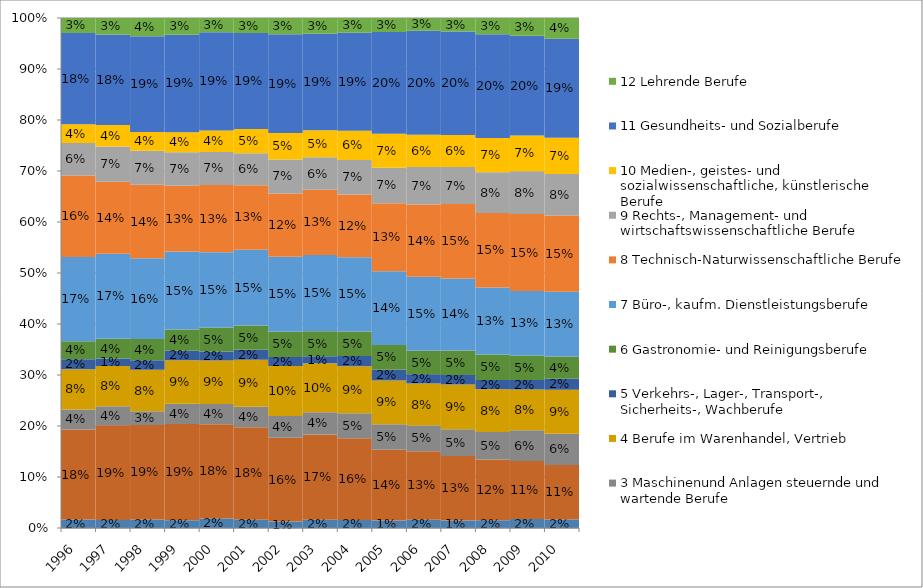
| Category | 1 Rohstoff gewinnende Berufe | 2 Be-, verarbeitende und instandsetzende Berufe | 3 Maschinenund Anlagen steuernde und wartende Berufe | 4 Berufe im Warenhandel, Vertrieb | 5 Verkehrs-, Lager-, Transport-, Sicherheits-, Wachberufe | 6 Gastronomie- und Reinigungsberufe | 7 Büro-, kaufm. Dienstleistungsberufe | 8 Technisch-Naturwissenschaftliche Berufe | 9 Rechts-, Management- und wirtschaftswissenschaftliche Berufe | 10 Medien-, geistes- und sozialwissenschaftliche, künstlerische Berufe | 11 Gesundheits- und Sozialberufe | 12 Lehrende Berufe |
|---|---|---|---|---|---|---|---|---|---|---|---|---|
| 1996.0 | 0.016 | 0.177 | 0.039 | 0.079 | 0.02 | 0.035 | 0.165 | 0.16 | 0.064 | 0.037 | 0.179 | 0.029 |
| 1997.0 | 0.016 | 0.186 | 0.037 | 0.079 | 0.015 | 0.039 | 0.167 | 0.141 | 0.069 | 0.042 | 0.177 | 0.032 |
| 1998.0 | 0.017 | 0.185 | 0.027 | 0.081 | 0.019 | 0.042 | 0.158 | 0.144 | 0.067 | 0.037 | 0.188 | 0.036 |
| 1999.0 | 0.015 | 0.189 | 0.039 | 0.086 | 0.019 | 0.041 | 0.153 | 0.129 | 0.066 | 0.039 | 0.192 | 0.033 |
| 2000.0 | 0.019 | 0.185 | 0.04 | 0.085 | 0.017 | 0.047 | 0.148 | 0.132 | 0.065 | 0.042 | 0.193 | 0.028 |
| 2001.0 | 0.016 | 0.182 | 0.04 | 0.092 | 0.02 | 0.047 | 0.148 | 0.127 | 0.062 | 0.048 | 0.188 | 0.029 |
| 2002.0 | 0.013 | 0.164 | 0.042 | 0.098 | 0.018 | 0.049 | 0.147 | 0.124 | 0.066 | 0.052 | 0.194 | 0.032 |
| 2003.0 | 0.016 | 0.167 | 0.044 | 0.096 | 0.014 | 0.049 | 0.149 | 0.128 | 0.064 | 0.053 | 0.189 | 0.031 |
| 2004.0 | 0.016 | 0.16 | 0.049 | 0.092 | 0.02 | 0.048 | 0.145 | 0.123 | 0.068 | 0.057 | 0.192 | 0.029 |
| 2005.0 | 0.015 | 0.139 | 0.05 | 0.086 | 0.021 | 0.049 | 0.145 | 0.133 | 0.07 | 0.066 | 0.2 | 0.027 |
| 2006.0 | 0.016 | 0.134 | 0.05 | 0.082 | 0.018 | 0.046 | 0.145 | 0.142 | 0.074 | 0.063 | 0.204 | 0.025 |
| 2007.0 | 0.015 | 0.126 | 0.053 | 0.088 | 0.018 | 0.048 | 0.141 | 0.146 | 0.072 | 0.063 | 0.203 | 0.026 |
| 2008.0 | 0.015 | 0.119 | 0.054 | 0.084 | 0.018 | 0.05 | 0.131 | 0.146 | 0.08 | 0.067 | 0.204 | 0.032 |
| 2009.0 | 0.018 | 0.114 | 0.06 | 0.08 | 0.019 | 0.048 | 0.126 | 0.151 | 0.084 | 0.07 | 0.196 | 0.035 |
| 2010.0 | 0.016 | 0.107 | 0.061 | 0.086 | 0.022 | 0.044 | 0.127 | 0.15 | 0.081 | 0.071 | 0.194 | 0.04 |